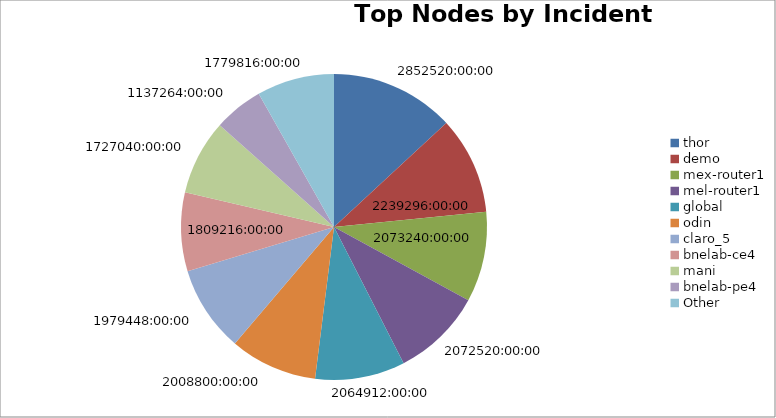
| Category | Series 0 |
|---|---|
| thor | 118855 |
| demo | 93304 |
| mex-router1 | 86385 |
| mel-router1 | 86355 |
| global | 86038 |
| odin | 83700 |
| claro_5 | 82477 |
| bnelab-ce4 | 75384 |
| mani | 71960 |
| bnelab-pe4 | 47386 |
| Other | 74159 |